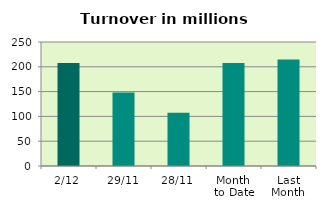
| Category | Series 0 |
|---|---|
| 2/12 | 207.55 |
| 29/11 | 148.405 |
| 28/11 | 107.244 |
| Month 
to Date | 207.55 |
| Last
Month | 214.794 |